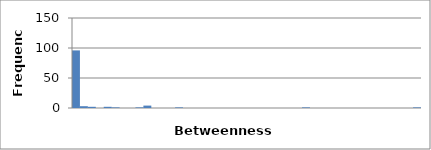
| Category | 96 |
|---|---|
| 0.0 | 96 |
| 10.63720930232558 | 3 |
| 21.27441860465116 | 2 |
| 31.91162790697674 | 0 |
| 42.54883720930232 | 2 |
| 53.1860465116279 | 1 |
| 63.82325581395348 | 0 |
| 74.46046511627907 | 0 |
| 85.09767441860464 | 1 |
| 95.73488372093021 | 4 |
| 106.37209302325579 | 0 |
| 117.00930232558136 | 0 |
| 127.64651162790693 | 0 |
| 138.2837209302325 | 1 |
| 148.92093023255808 | 0 |
| 159.55813953488365 | 0 |
| 170.19534883720922 | 0 |
| 180.8325581395348 | 0 |
| 191.46976744186037 | 0 |
| 202.10697674418594 | 0 |
| 212.74418604651152 | 0 |
| 223.3813953488371 | 0 |
| 234.01860465116266 | 0 |
| 244.65581395348823 | 0 |
| 255.2930232558138 | 0 |
| 265.9302325581394 | 0 |
| 276.56744186046495 | 0 |
| 287.2046511627905 | 0 |
| 297.8418604651161 | 0 |
| 308.4790697674417 | 1 |
| 319.11627906976724 | 0 |
| 329.7534883720928 | 0 |
| 340.3906976744184 | 0 |
| 351.02790697674396 | 0 |
| 361.66511627906954 | 0 |
| 372.3023255813951 | 0 |
| 382.9395348837207 | 0 |
| 393.57674418604626 | 0 |
| 404.2139534883718 | 0 |
| 414.8511627906974 | 0 |
| 425.488372093023 | 0 |
| 436.12558139534855 | 0 |
| 446.7627906976741 | 0 |
| 457.4 | 1 |